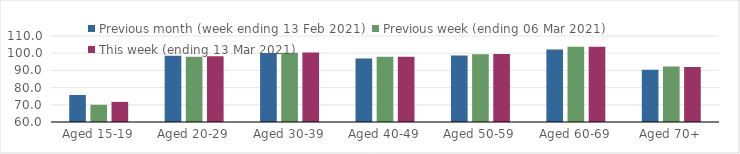
| Category | Previous month (week ending 13 Feb 2021) | Previous week (ending 06 Mar 2021) | This week (ending 13 Mar 2021) |
|---|---|---|---|
| Aged 15-19 | 75.72 | 70.01 | 71.71 |
| Aged 20-29 | 98.47 | 97.99 | 98.2 |
| Aged 30-39 | 100.08 | 100.2 | 100.42 |
| Aged 40-49 | 96.98 | 97.99 | 97.96 |
| Aged 50-59 | 98.65 | 99.44 | 99.51 |
| Aged 60-69 | 102.1 | 103.82 | 103.8 |
| Aged 70+ | 90.35 | 92.27 | 92.02 |